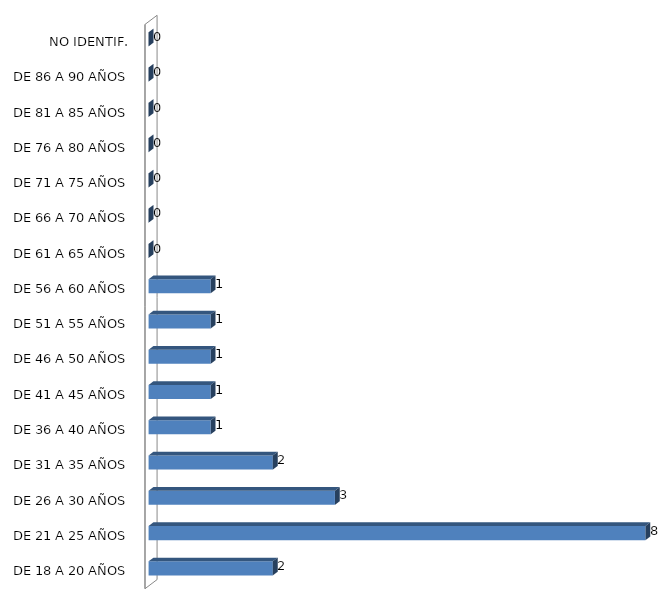
| Category | ESTADO  DE EBRIEDAD |
|---|---|
| DE 18 A 20 AÑOS | 2 |
| DE 21 A 25 AÑOS | 8 |
| DE 26 A 30 AÑOS | 3 |
| DE 31 A 35 AÑOS | 2 |
| DE 36 A 40 AÑOS | 1 |
| DE 41 A 45 AÑOS | 1 |
| DE 46 A 50 AÑOS | 1 |
| DE 51 A 55 AÑOS | 1 |
| DE 56 A 60 AÑOS | 1 |
| DE 61 A 65 AÑOS | 0 |
| DE 66 A 70 AÑOS | 0 |
| DE 71 A 75 AÑOS | 0 |
| DE 76 A 80 AÑOS | 0 |
| DE 81 A 85 AÑOS | 0 |
| DE 86 A 90 AÑOS | 0 |
| NO IDENTIF. | 0 |